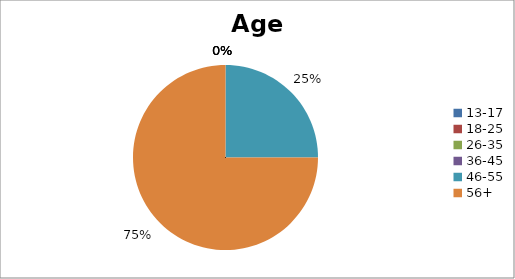
| Category | Age Group |
|---|---|
| 13-17 | 0 |
| 18-25 | 0 |
| 26-35 | 0 |
| 36-45 | 0 |
| 46-55 | 1 |
| 56+ | 3 |